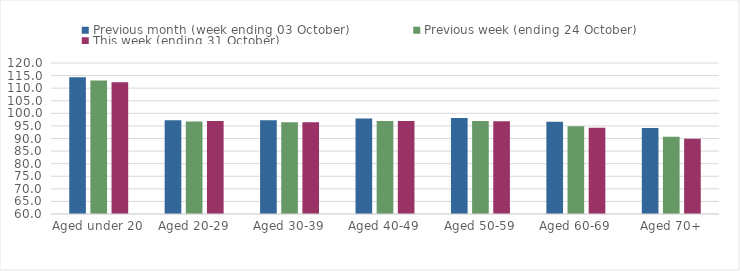
| Category | Previous month (week ending 03 October) | Previous week (ending 24 October) | This week (ending 31 October) |
|---|---|---|---|
| Aged under 20 | 114.31 | 113.05 | 112.38 |
| Aged 20-29 | 97.22 | 96.8 | 96.95 |
| Aged 30-39 | 97.26 | 96.43 | 96.48 |
| Aged 40-49 | 97.91 | 96.96 | 96.99 |
| Aged 50-59 | 98.15 | 96.95 | 96.85 |
| Aged 60-69 | 96.64 | 94.84 | 94.29 |
| Aged 70+ | 94.14 | 90.73 | 89.91 |